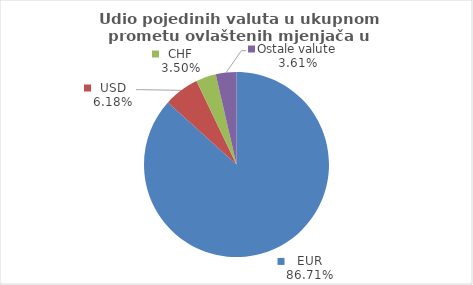
| Category | Series 0 |
|---|---|
| EUR | 86.707 |
| USD | 6.178 |
| CHF | 3.505 |
| Ostale valute | 3.61 |